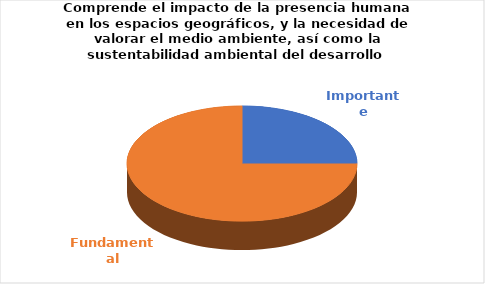
| Category | Series 0 |
|---|---|
| Importante | 3 |
| Fundamental | 9 |